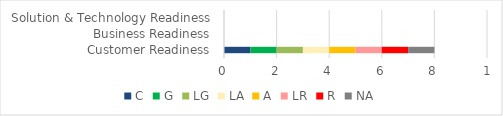
| Category | C | G | LG | LA | A | LR | R | NA |
|---|---|---|---|---|---|---|---|---|
| Customer Readiness | 1 | 1 | 1 | 1 | 1 | 1 | 1 | 1 |
| Business Readiness | 0 | 0 | 0 | 0 | 0 | 0 | 0 | 0 |
| Solution & Technology Readiness | 0 | 0 | 0 | 0 | 0 | 0 | 0 | 0 |